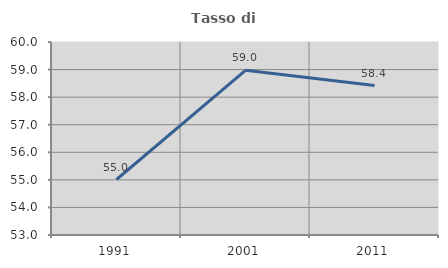
| Category | Tasso di occupazione   |
|---|---|
| 1991.0 | 55.012 |
| 2001.0 | 58.973 |
| 2011.0 | 58.419 |